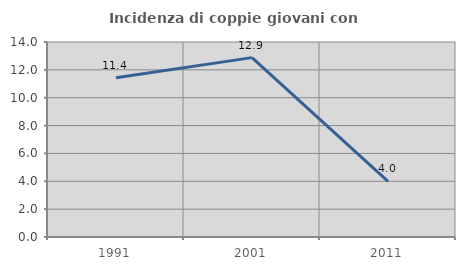
| Category | Incidenza di coppie giovani con figli |
|---|---|
| 1991.0 | 11.429 |
| 2001.0 | 12.879 |
| 2011.0 | 4 |